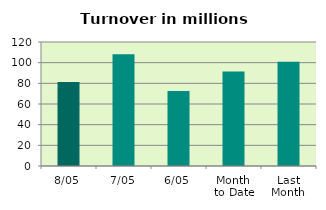
| Category | Series 0 |
|---|---|
| 8/05 | 81.219 |
| 7/05 | 108.186 |
| 6/05 | 72.651 |
| Month 
to Date | 91.505 |
| Last
Month | 100.792 |